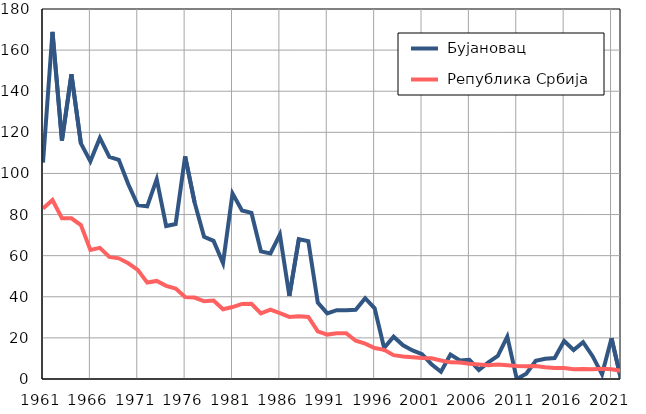
| Category |  Бујановац |  Република Србија |
|---|---|---|
| 1961.0 | 105.3 | 82.9 |
| 1962.0 | 168.9 | 87.1 |
| 1963.0 | 116 | 78.2 |
| 1964.0 | 148.2 | 78.2 |
| 1965.0 | 114.6 | 74.9 |
| 1966.0 | 105.9 | 62.8 |
| 1967.0 | 117.3 | 63.8 |
| 1968.0 | 108.1 | 59.4 |
| 1969.0 | 106.6 | 58.7 |
| 1970.0 | 94.7 | 56.3 |
| 1971.0 | 84.6 | 53.1 |
| 1972.0 | 84 | 46.9 |
| 1973.0 | 97.2 | 47.7 |
| 1974.0 | 74.4 | 45.3 |
| 1975.0 | 75.4 | 44 |
| 1976.0 | 108.3 | 39.9 |
| 1977.0 | 85.9 | 39.6 |
| 1978.0 | 69.2 | 37.8 |
| 1979.0 | 67.2 | 38.2 |
| 1980.0 | 56.4 | 33.9 |
| 1981.0 | 90.3 | 35 |
| 1982.0 | 82 | 36.5 |
| 1983.0 | 80.8 | 36.6 |
| 1984.0 | 62.1 | 31.9 |
| 1985.0 | 61.1 | 33.7 |
| 1986.0 | 70.3 | 32 |
| 1987.0 | 40.4 | 30.2 |
| 1988.0 | 68 | 30.5 |
| 1989.0 | 67.1 | 30.2 |
| 1990.0 | 37.2 | 23.2 |
| 1991.0 | 31.9 | 21.6 |
| 1992.0 | 33.5 | 22.3 |
| 1993.0 | 33.5 | 22.3 |
| 1994.0 | 33.7 | 18.6 |
| 1995.0 | 39.3 | 17.2 |
| 1996.0 | 34.4 | 15.1 |
| 1997.0 | 15.1 | 14.2 |
| 1998.0 | 20.6 | 11.6 |
| 1999.0 | 16.4 | 11 |
| 2000.0 | 13.9 | 10.6 |
| 2001.0 | 12.1 | 10.2 |
| 2002.0 | 7.2 | 10.1 |
| 2003.0 | 3.5 | 9 |
| 2004.0 | 11.9 | 8.1 |
| 2005.0 | 9 | 8 |
| 2006.0 | 9.3 | 7.4 |
| 2007.0 | 4.4 | 7.1 |
| 2008.0 | 8.1 | 6.7 |
| 2009.0 | 11.2 | 7 |
| 2010.0 | 20.6 | 6.7 |
| 2011.0 | 0 | 6.3 |
| 2012.0 | 2.6 | 6.2 |
| 2013.0 | 8.8 | 6.3 |
| 2014.0 | 9.8 | 5.7 |
| 2015.0 | 10.2 | 5.3 |
| 2016.0 | 18.5 | 5.4 |
| 2017.0 | 14.1 | 4.7 |
| 2018.0 | 17.9 | 4.9 |
| 2019.0 | 11.1 | 4.8 |
| 2020.0 | 2.3 | 5 |
| 2021.0 | 19.8 | 4.7 |
| 2022.0 | 0 | 4 |